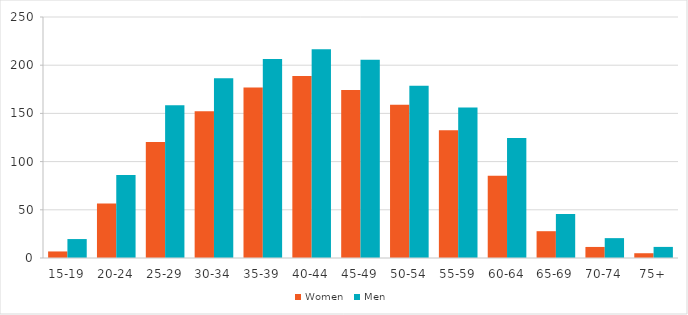
| Category | Women | Men |
|---|---|---|
| 15-19 | 6.8 | 19.652 |
| 20-24 | 56.528 | 86.112 |
| 25-29 | 120.337 | 158.341 |
| 30-34 | 152.271 | 186.457 |
| 35-39 | 176.802 | 206.303 |
| 40-44 | 188.902 | 216.606 |
| 45-49 | 174.376 | 205.763 |
| 50-54 | 158.911 | 178.561 |
| 55-59 | 132.633 | 156.209 |
| 60-64 | 85.254 | 124.607 |
| 65-69 | 27.799 | 45.716 |
| 70-74 | 11.465 | 20.605 |
| 75+ | 4.943 | 11.509 |